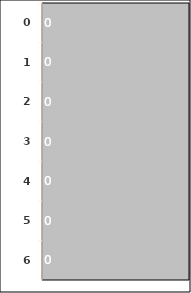
| Category | 0 1 2 3 4 5 6 |
|---|---|
| 0.0 | 0 |
| 1.0 | 0 |
| 2.0 | 0 |
| 3.0 | 0 |
| 4.0 | 0 |
| 5.0 | 0 |
| 6.0 | 0 |